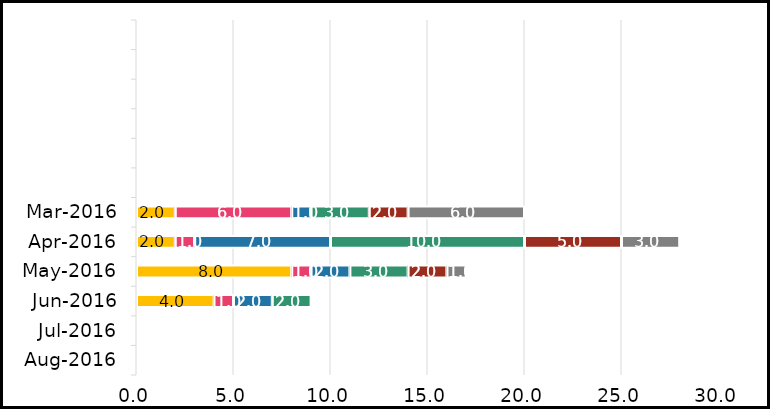
| Category | RESEARCH | APPROVAL | DEVELOP | TEST | EXECUTE | LAUNCH |
|---|---|---|---|---|---|---|
| Aug-2016 | 0 | 0 | 0 | 0 | 0 | 0 |
| Jul-2016 | 0 | 0 | 0 | 0 | 0 | 0 |
| Jun-2016 | 4 | 1 | 2 | 2 | 0 | 0 |
| May-2016 | 8 | 1 | 2 | 3 | 2 | 1 |
| Apr-2016 | 2 | 1 | 7 | 10 | 5 | 3 |
| Mar-2016 | 2 | 6 | 1 | 3 | 2 | 6 |